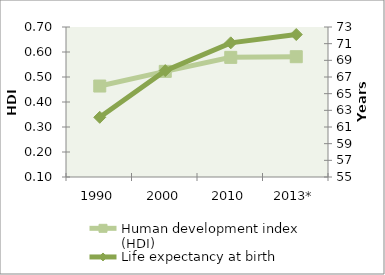
| Category | Human development index (HDI) |
|---|---|
| 1990 | 0.464 |
| 2000 | 0.523 |
| 2010 | 0.579 |
| 2013* | 0.581 |